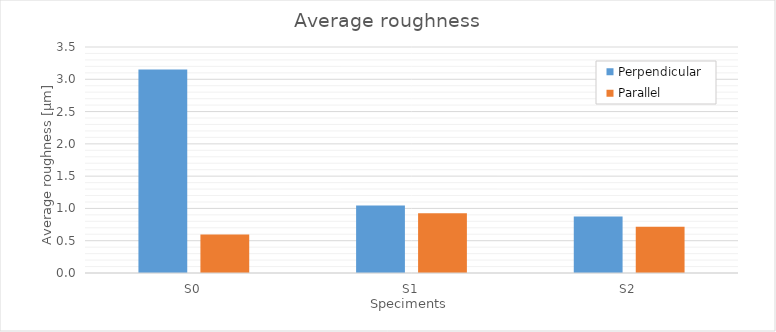
| Category | Perpendicular | Parallel |
|---|---|---|
| S0 | 3.151 | 0.596 |
| S1 | 1.044 | 0.926 |
| S2 | 0.874 | 0.717 |